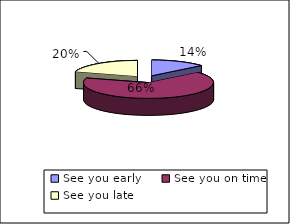
| Category | When you arrived at the surgery for your appointment did the doctor |
|---|---|
| See you early | 13 |
| See you on time | 62 |
| See you late | 19 |